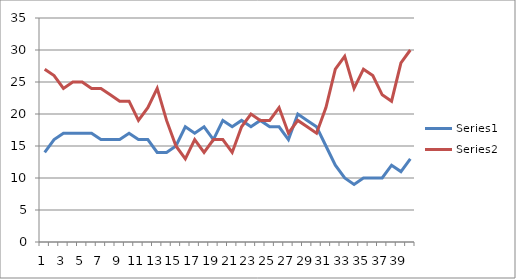
| Category | Series 0 | Series 1 |
|---|---|---|
| 0 | 14 | 27 |
| 1 | 16 | 26 |
| 2 | 17 | 24 |
| 3 | 17 | 25 |
| 4 | 17 | 25 |
| 5 | 17 | 24 |
| 6 | 16 | 24 |
| 7 | 16 | 23 |
| 8 | 16 | 22 |
| 9 | 17 | 22 |
| 10 | 16 | 19 |
| 11 | 16 | 21 |
| 12 | 14 | 24 |
| 13 | 14 | 19 |
| 14 | 15 | 15 |
| 15 | 18 | 13 |
| 16 | 17 | 16 |
| 17 | 18 | 14 |
| 18 | 16 | 16 |
| 19 | 19 | 16 |
| 20 | 18 | 14 |
| 21 | 19 | 18 |
| 22 | 18 | 20 |
| 23 | 19 | 19 |
| 24 | 18 | 19 |
| 25 | 18 | 21 |
| 26 | 16 | 17 |
| 27 | 20 | 19 |
| 28 | 19 | 18 |
| 29 | 18 | 17 |
| 30 | 15 | 21 |
| 31 | 12 | 27 |
| 32 | 10 | 29 |
| 33 | 9 | 24 |
| 34 | 10 | 27 |
| 35 | 10 | 26 |
| 36 | 10 | 23 |
| 37 | 12 | 22 |
| 38 | 11 | 28 |
| 39 | 13 | 30 |